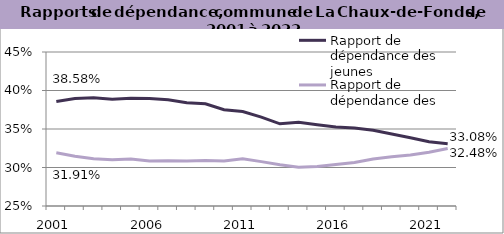
| Category | Rapport de dépendance des jeunes | Rapport de dépendance des personnes âgées |
|---|---|---|
| 2001.0 | 0.386 | 0.319 |
| 2002.0 | 0.39 | 0.315 |
| 2003.0 | 0.39 | 0.311 |
| 2004.0 | 0.389 | 0.31 |
| 2005.0 | 0.39 | 0.311 |
| 2006.0 | 0.39 | 0.308 |
| 2007.0 | 0.388 | 0.309 |
| 2008.0 | 0.384 | 0.308 |
| 2009.0 | 0.383 | 0.309 |
| 2010.0 | 0.375 | 0.308 |
| 2011.0 | 0.373 | 0.311 |
| 2012.0 | 0.366 | 0.308 |
| 2013.0 | 0.357 | 0.304 |
| 2014.0 | 0.359 | 0.3 |
| 2015.0 | 0.355 | 0.301 |
| 2016.0 | 0.353 | 0.304 |
| 2017.0 | 0.351 | 0.307 |
| 2018.0 | 0.348 | 0.311 |
| 2019.0 | 0.344 | 0.314 |
| 2020.0 | 0.339 | 0.316 |
| 2021.0 | 0.333 | 0.32 |
| 2022.0 | 0.331 | 0.325 |